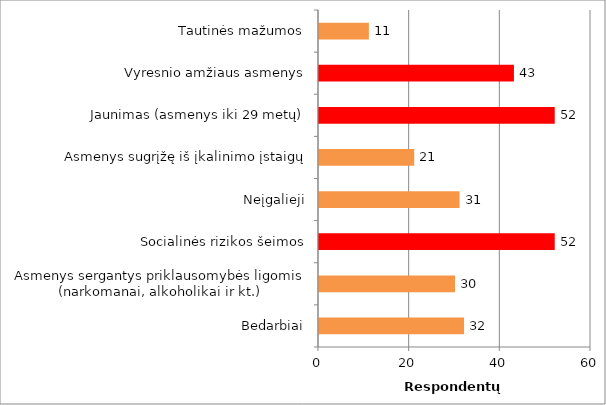
| Category | Series 0 |
|---|---|
| Bedarbiai | 32 |
| Asmenys sergantys priklausomybės ligomis (narkomanai, alkoholikai ir kt.) | 30 |
| Socialinės rizikos šeimos | 52 |
| Neįgalieji | 31 |
| Asmenys sugrįžę iš įkalinimo įstaigų | 21 |
| Jaunimas (asmenys iki 29 metų) | 52 |
| Vyresnio amžiaus asmenys | 43 |
| Tautinės mažumos | 11 |